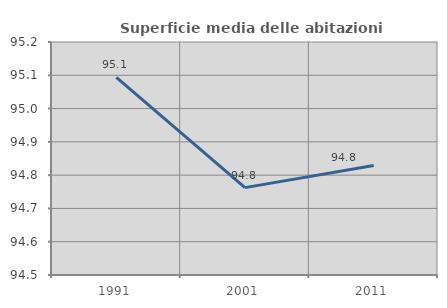
| Category | Superficie media delle abitazioni occupate |
|---|---|
| 1991.0 | 95.094 |
| 2001.0 | 94.763 |
| 2011.0 | 94.829 |